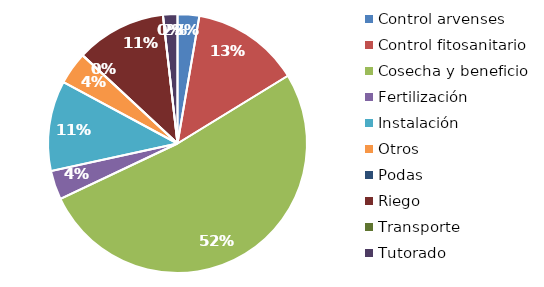
| Category | Valor |
|---|---|
| Control arvenses | 180000 |
| Control fitosanitario | 900000 |
| Cosecha y beneficio | 3440000 |
| Fertilización | 240000 |
| Instalación | 750000 |
| Otros | 270000 |
| Podas | 0 |
| Riego | 750000 |
| Transporte | 0 |
| Tutorado | 120000 |